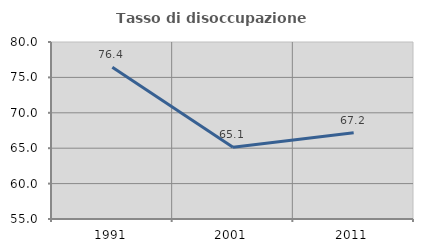
| Category | Tasso di disoccupazione giovanile  |
|---|---|
| 1991.0 | 76.421 |
| 2001.0 | 65.143 |
| 2011.0 | 67.188 |